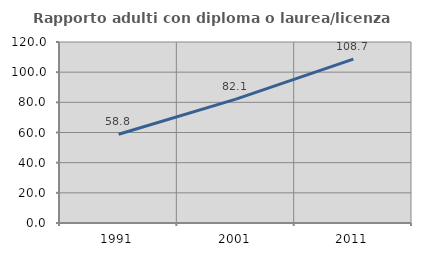
| Category | Rapporto adulti con diploma o laurea/licenza media  |
|---|---|
| 1991.0 | 58.831 |
| 2001.0 | 82.123 |
| 2011.0 | 108.679 |